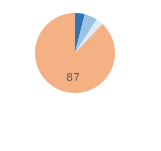
| Category | Series 0 |
|---|---|
| Importants | 3.935 |
| Assez importants | 5.171 |
| Peu importants | 2.846 |
| Pas de dégradations | 87.208 |